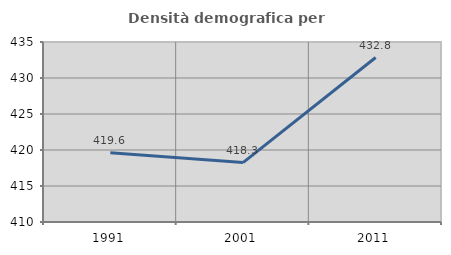
| Category | Densità demografica |
|---|---|
| 1991.0 | 419.625 |
| 2001.0 | 418.252 |
| 2011.0 | 432.845 |